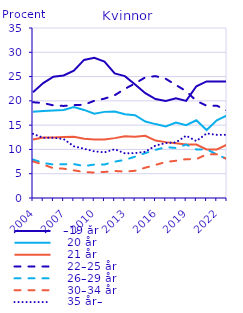
| Category |   –19 år |    20 år |    21 år |    22–25 år |    26–29 år |    30–34 år |    35 år– |
|---|---|---|---|---|---|---|---|
| 2004.0 | 21.794 | 17.776 | 12.036 | 19.721 | 7.932 | 7.535 | 13.206 |
| 2005.0 | 23.656 | 17.903 | 12.449 | 19.54 | 7.205 | 6.863 | 12.384 |
| 2006.0 | 24.98 | 18.036 | 12.474 | 19.072 | 6.892 | 6.132 | 12.414 |
| 2007.0 | 25.217 | 18.131 | 12.58 | 18.957 | 6.952 | 6.04 | 12.123 |
| 2008.0 | 26.231 | 18.728 | 12.592 | 19.125 | 6.989 | 5.692 | 10.643 |
| 2009.0 | 28.43 | 18.132 | 12.185 | 19.197 | 6.559 | 5.354 | 10.143 |
| 2010.0 | 28.848 | 17.368 | 12.041 | 20.013 | 6.883 | 5.236 | 9.611 |
| 2011.0 | 28.101 | 17.732 | 12.051 | 20.458 | 6.9 | 5.367 | 9.391 |
| 2012.0 | 25.636 | 17.794 | 12.326 | 21.151 | 7.484 | 5.563 | 10.045 |
| 2013.0 | 25.094 | 17.261 | 12.706 | 22.471 | 7.847 | 5.433 | 9.187 |
| 2014.0 | 23.367 | 17.052 | 12.618 | 23.598 | 8.513 | 5.608 | 9.243 |
| 2015.0 | 21.587 | 15.748 | 12.803 | 24.842 | 9.255 | 6.244 | 9.521 |
| 2016.0 | 20.379 | 15.215 | 11.82 | 25.092 | 9.895 | 6.807 | 10.792 |
| 2017.0 | 19.998 | 14.743 | 11.503 | 24.544 | 10.477 | 7.423 | 11.311 |
| 2018.0 | 20.533 | 15.514 | 11.279 | 23.258 | 10.305 | 7.665 | 11.446 |
| 2019.0 | 20 | 15 | 11 | 22 | 11 | 8 | 12.82 |
| 2020.0 | 23 | 16 | 11 | 20 | 10 | 8 | 11.717 |
| 2021.0 | 24 | 14 | 10 | 19 | 10 | 9 | 13.293 |
| 2022.0 | 24 | 16 | 10 | 19 | 9 | 9 | 13 |
| 2023.0 | 24 | 17 | 11 | 18 | 8 | 8 | 13 |